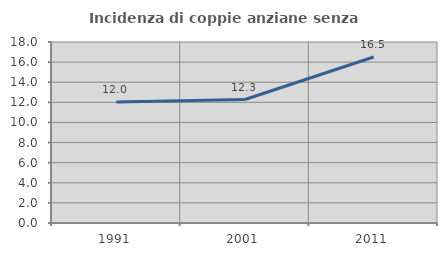
| Category | Incidenza di coppie anziane senza figli  |
|---|---|
| 1991.0 | 12.03 |
| 2001.0 | 12.281 |
| 2011.0 | 16.508 |